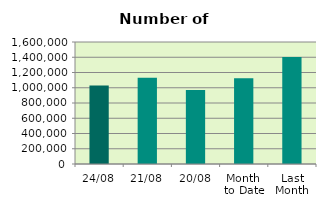
| Category | Series 0 |
|---|---|
| 24/08 | 1028498 |
| 21/08 | 1131450 |
| 20/08 | 971118 |
| Month 
to Date | 1123327.125 |
| Last
Month | 1404253.739 |